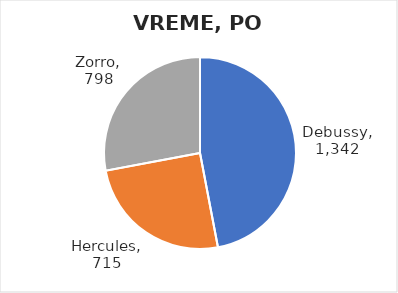
| Category | Ukupno minuta |
|---|---|
| Debussy | 1342 |
| Hercules | 715 |
| Zorro | 798 |